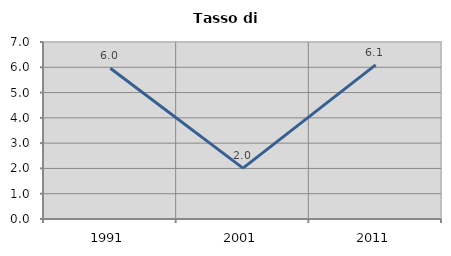
| Category | Tasso di disoccupazione   |
|---|---|
| 1991.0 | 5.962 |
| 2001.0 | 2.012 |
| 2011.0 | 6.096 |